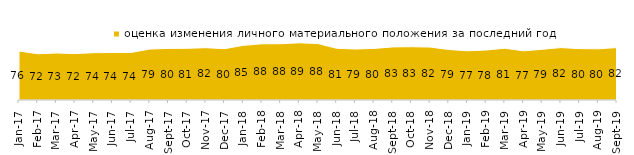
| Category | оценка изменения личного материального положения за последний год |
|---|---|
| 2017-01-01 | 76.3 |
| 2017-02-01 | 72.1 |
| 2017-03-01 | 73.2 |
| 2017-04-01 | 72.3 |
| 2017-05-01 | 73.7 |
| 2017-06-01 | 74.05 |
| 2017-07-01 | 74.1 |
| 2017-08-01 | 79.4 |
| 2017-09-01 | 80.4 |
| 2017-10-01 | 80.55 |
| 2017-11-01 | 81.55 |
| 2017-12-01 | 80 |
| 2018-01-01 | 85.15 |
| 2018-02-01 | 87.55 |
| 2018-03-01 | 87.65 |
| 2018-04-01 | 89.15 |
| 2018-05-01 | 87.9 |
| 2018-06-01 | 80.55 |
| 2018-07-01 | 79.45 |
| 2018-08-01 | 80.4 |
| 2018-09-01 | 82.75 |
| 2018-10-01 | 83.05 |
| 2018-11-01 | 82.485 |
| 2018-12-01 | 78.65 |
| 2019-01-01 | 76.7 |
| 2019-02-01 | 77.9 |
| 2019-03-01 | 80.656 |
| 2019-04-01 | 76.584 |
| 2019-05-01 | 79 |
| 2019-06-01 | 81.696 |
| 2019-07-01 | 80.05 |
| 2019-08-01 | 79.77 |
| 2019-09-01 | 81.733 |